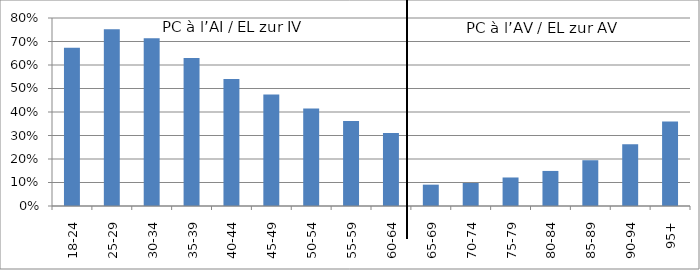
| Category | PC à l’AI / EL zur IV PC à l’AV / EL zur AV |
|---|---|
| 18-24 | 0.673 |
| 25-29 | 0.752 |
| 30-34 | 0.714 |
| 35-39 | 0.629 |
| 40-44 | 0.54 |
| 45-49 | 0.474 |
| 50-54 | 0.415 |
| 55-59 | 0.362 |
| 60-64 | 0.311 |
| 65-69 | 0.091 |
| 70-74 | 0.098 |
| 75-79 | 0.121 |
| 80-84 | 0.149 |
| 85-89 | 0.195 |
| 90-94 | 0.262 |
| 95+ | 0.359 |